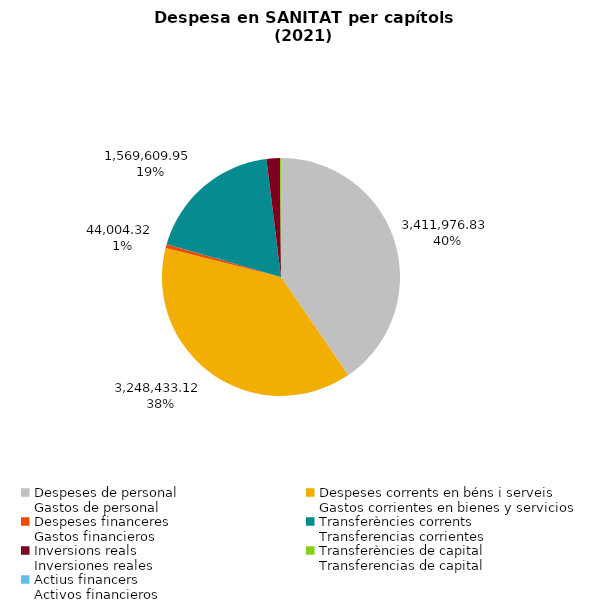
| Category | Series 0 |
|---|---|
| Despeses de personal
Gastos de personal | 3411976.83 |
| Despeses corrents en béns i serveis
Gastos corrientes en bienes y servicios | 3248433.12 |
| Despeses financeres
Gastos financieros | 44004.32 |
| Transferències corrents
Transferencias corrientes | 1569609.95 |
| Inversions reals
Inversiones reales | 154679.33 |
| Transferències de capital
Transferencias de capital | 10903.5 |
| Actius financers
Activos financieros | 0 |